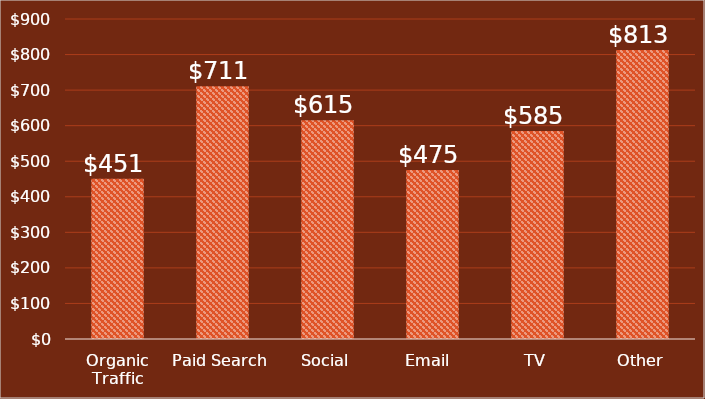
| Category | Cost per Acquisition |
|---|---|
| Organic Traffic | 451 |
| Paid Search | 711 |
| Social | 615 |
| Email  | 475 |
| TV | 585 |
| Other | 813 |